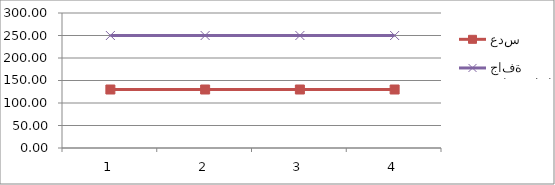
| Category | عدس | فاصوليا جافة |
|---|---|---|
| 0 | 130 | 250 |
| 1 | 130 | 250 |
| 2 | 130 | 250 |
| 3 | 130 | 250 |